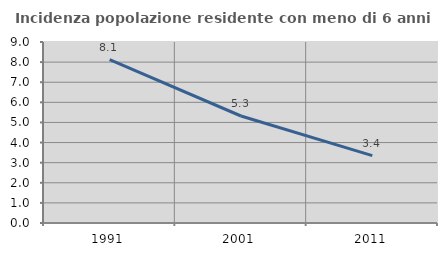
| Category | Incidenza popolazione residente con meno di 6 anni |
|---|---|
| 1991.0 | 8.121 |
| 2001.0 | 5.321 |
| 2011.0 | 3.353 |